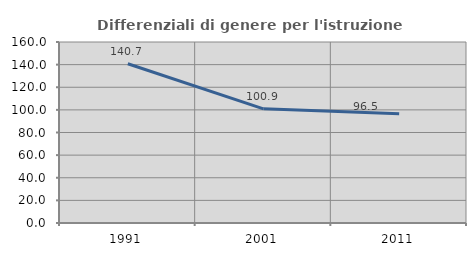
| Category | Differenziali di genere per l'istruzione superiore |
|---|---|
| 1991.0 | 140.731 |
| 2001.0 | 100.897 |
| 2011.0 | 96.473 |